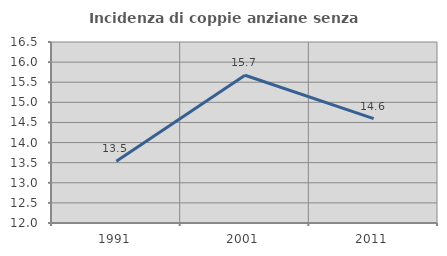
| Category | Incidenza di coppie anziane senza figli  |
|---|---|
| 1991.0 | 13.534 |
| 2001.0 | 15.674 |
| 2011.0 | 14.596 |